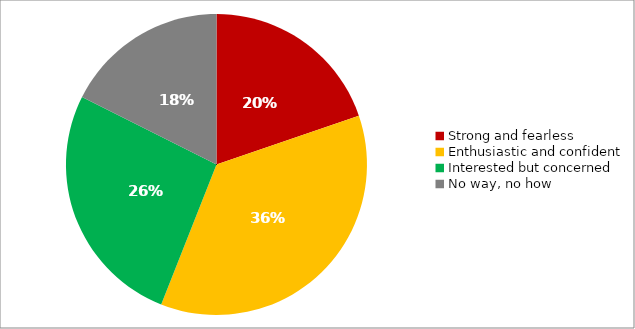
| Category | Responses |
|---|---|
| Strong and fearless | 0.197 |
| Enthusiastic and confident | 0.362 |
| Interested but concerned | 0.264 |
| No way, no how | 0.176 |